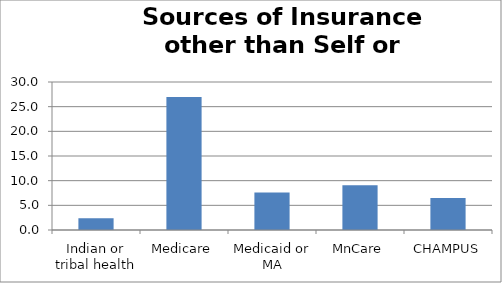
| Category | Series 0 |
|---|---|
| Indian or tribal health | 2.383 |
| Medicare | 26.947 |
| Medicaid or MA | 7.596 |
| MnCare | 9.063 |
| CHAMPUS | 6.467 |